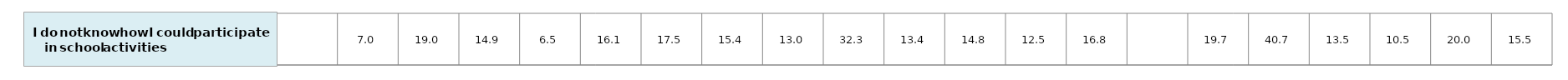
| Category | #REF! |
|---|---|
| nan | 1 |
| 6.990776427002721 | 1 |
| 19.022283718055043 | 1 |
| 14.85436135300593 | 1 |
| 6.52446044003251 | 1 |
| 16.06137342217912 | 1 |
| 17.45487118013014 | 1 |
| 15.38576029263865 | 1 |
| 13.015253547271149 | 1 |
| 32.27066204949721 | 1 |
| 13.39302291697127 | 1 |
| 14.757994788028189 | 1 |
| 12.48144346772773 | 1 |
| 16.780863115404593 | 1 |
| nan | 1 |
| 19.691772975419532 | 1 |
| 40.65043451883462 | 1 |
| 13.47895833592053 | 1 |
| 10.4881002942492 | 1 |
| 20.04865420111377 | 1 |
| 15.48535214920537 | 1 |